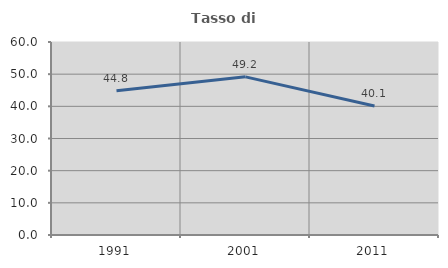
| Category | Tasso di occupazione   |
|---|---|
| 1991.0 | 44.828 |
| 2001.0 | 49.164 |
| 2011.0 | 40.079 |